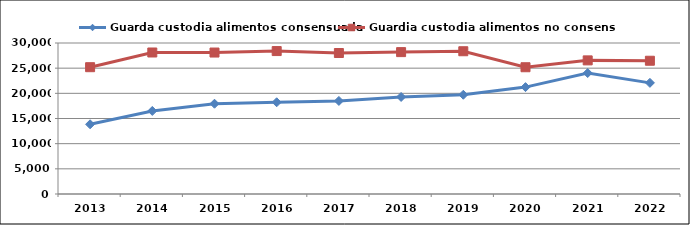
| Category | Guarda custodia alimentos consensuada | Guardia custodia alimentos no consensuada |
|---|---|---|
| 2013.0 | 13849 | 25194 |
| 2014.0 | 16502 | 28114 |
| 2015.0 | 17932 | 28104 |
| 2016.0 | 18225 | 28398 |
| 2017.0 | 18492 | 28011 |
| 2018.0 | 19281 | 28188 |
| 2019.0 | 19716 | 28364 |
| 2020.0 | 21236 | 25184 |
| 2021.0 | 24032 | 26548 |
| 2022.0 | 22081 | 26476 |